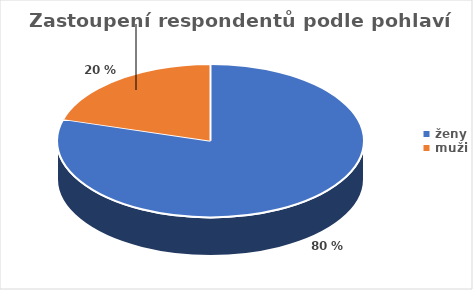
| Category | Series 0 |
|---|---|
| ženy | 0.795 |
| muži | 0.205 |